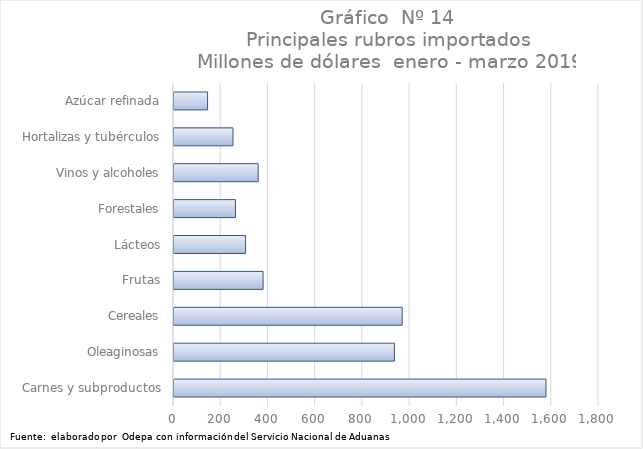
| Category | Series 0 |
|---|---|
| Carnes y subproductos | 1575485.873 |
| Oleaginosas | 933629.348 |
| Cereales | 966371.186 |
| Frutas | 377304.833 |
| Lácteos | 303014.302 |
| Forestales | 260092 |
| Vinos y alcoholes | 356386.358 |
| Hortalizas y tubérculos | 249699.166 |
| Azúcar refinada | 142156.137 |